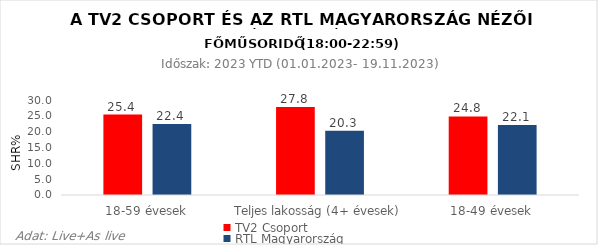
| Category | TV2 Csoport | RTL Magyarország |
|---|---|---|
| 18-59 évesek | 25.4 | 22.4 |
| Teljes lakosság (4+ évesek) | 27.8 | 20.3 |
| 18-49 évesek | 24.8 | 22.1 |